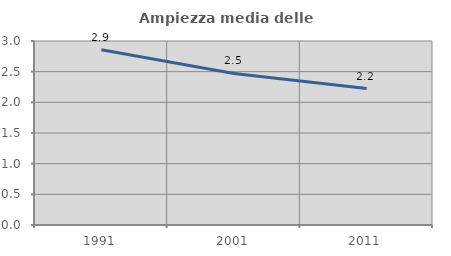
| Category | Ampiezza media delle famiglie |
|---|---|
| 1991.0 | 2.857 |
| 2001.0 | 2.471 |
| 2011.0 | 2.225 |